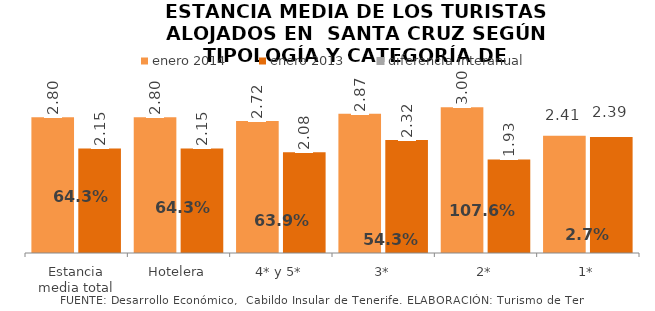
| Category | enero 2014 | enero 2013 |
|---|---|---|
| Estancia media total | 2.797 | 2.154 |
| Hotelera | 2.797 | 2.154 |
| 4* y 5* | 2.715 | 2.076 |
| 3* | 2.866 | 2.324 |
| 2* | 3.002 | 1.926 |
| 1* | 2.414 | 2.388 |